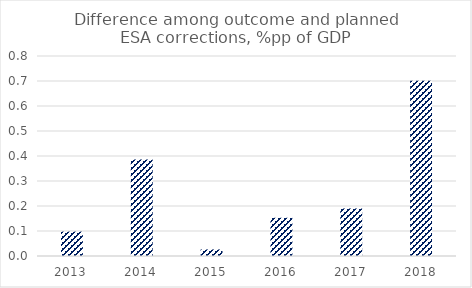
| Category | Series 0 |
|---|---|
| 2013.0 | 0.097 |
| 2014.0 | 0.386 |
| 2015.0 | 0.026 |
| 2016.0 | 0.153 |
| 2017.0 | 0.19 |
| 2018.0 | 0.701 |